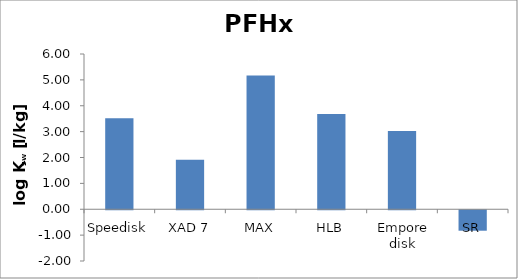
| Category | PFHxA |
|---|---|
| Speedisk | 3.519 |
| XAD 7 | 1.916 |
| MAX | 5.165 |
| HLB | 3.68 |
| Empore disk | 3.02 |
| SR | -0.791 |